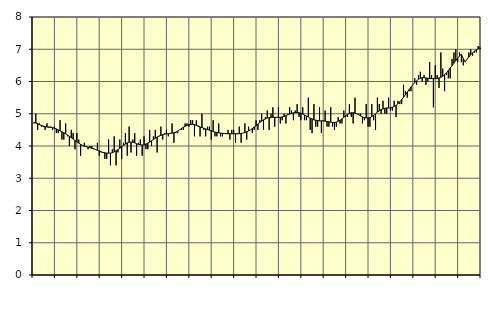
| Category | Information och kommunikation, SNI 58-63 | Series 1 |
|---|---|---|
| nan | 4.7 | 4.73 |
| 1.0 | 5 | 4.71 |
| 1.0 | 4.5 | 4.69 |
| 1.0 | 4.7 | 4.66 |
| 1.0 | 4.6 | 4.64 |
| 1.0 | 4.6 | 4.62 |
| 1.0 | 4.5 | 4.6 |
| 1.0 | 4.7 | 4.59 |
| 1.0 | 4.6 | 4.58 |
| 1.0 | 4.6 | 4.58 |
| 1.0 | 4.5 | 4.57 |
| 1.0 | 4.6 | 4.55 |
| nan | 4.4 | 4.53 |
| 2.0 | 4.4 | 4.5 |
| 2.0 | 4.8 | 4.47 |
| 2.0 | 4.2 | 4.44 |
| 2.0 | 4.2 | 4.41 |
| 2.0 | 4.7 | 4.38 |
| 2.0 | 4.3 | 4.34 |
| 2.0 | 4 | 4.3 |
| 2.0 | 4.5 | 4.26 |
| 2.0 | 4.4 | 4.22 |
| 2.0 | 3.9 | 4.17 |
| 2.0 | 4.4 | 4.13 |
| nan | 4.2 | 4.09 |
| 3.0 | 3.7 | 4.05 |
| 3.0 | 4 | 4.02 |
| 3.0 | 4.1 | 3.99 |
| 3.0 | 4 | 3.98 |
| 3.0 | 3.9 | 3.96 |
| 3.0 | 4 | 3.95 |
| 3.0 | 4 | 3.93 |
| 3.0 | 3.9 | 3.92 |
| 3.0 | 3.9 | 3.89 |
| 3.0 | 4.1 | 3.87 |
| 3.0 | 3.7 | 3.85 |
| nan | 3.8 | 3.82 |
| 4.0 | 3.8 | 3.8 |
| 4.0 | 3.6 | 3.79 |
| 4.0 | 3.6 | 3.78 |
| 4.0 | 4.2 | 3.78 |
| 4.0 | 3.4 | 3.78 |
| 4.0 | 3.9 | 3.79 |
| 4.0 | 4.3 | 3.82 |
| 4.0 | 3.4 | 3.85 |
| 4.0 | 3.8 | 3.89 |
| 4.0 | 4.2 | 3.93 |
| 4.0 | 3.6 | 3.98 |
| nan | 4.1 | 4.02 |
| 5.0 | 4.4 | 4.06 |
| 5.0 | 3.7 | 4.1 |
| 5.0 | 4.6 | 4.12 |
| 5.0 | 3.8 | 4.12 |
| 5.0 | 4.2 | 4.12 |
| 5.0 | 4.4 | 4.1 |
| 5.0 | 3.7 | 4.07 |
| 5.0 | 4.1 | 4.05 |
| 5.0 | 4.2 | 4.04 |
| 5.0 | 3.7 | 4.03 |
| 5.0 | 4.3 | 4.04 |
| nan | 3.9 | 4.06 |
| 6.0 | 3.9 | 4.09 |
| 6.0 | 4.5 | 4.12 |
| 6.0 | 4 | 4.16 |
| 6.0 | 4.3 | 4.2 |
| 6.0 | 4.5 | 4.24 |
| 6.0 | 3.8 | 4.28 |
| 6.0 | 4.3 | 4.31 |
| 6.0 | 4.6 | 4.33 |
| 6.0 | 4.2 | 4.35 |
| 6.0 | 4.4 | 4.37 |
| 6.0 | 4.5 | 4.38 |
| nan | 4.3 | 4.38 |
| 7.0 | 4.4 | 4.39 |
| 7.0 | 4.7 | 4.4 |
| 7.0 | 4.1 | 4.41 |
| 7.0 | 4.4 | 4.43 |
| 7.0 | 4.4 | 4.46 |
| 7.0 | 4.5 | 4.5 |
| 7.0 | 4.5 | 4.54 |
| 7.0 | 4.5 | 4.58 |
| 7.0 | 4.7 | 4.61 |
| 7.0 | 4.7 | 4.64 |
| 7.0 | 4.6 | 4.66 |
| nan | 4.8 | 4.67 |
| 8.0 | 4.8 | 4.67 |
| 8.0 | 4.3 | 4.66 |
| 8.0 | 4.8 | 4.64 |
| 8.0 | 4.6 | 4.62 |
| 8.0 | 4.3 | 4.59 |
| 8.0 | 5 | 4.57 |
| 8.0 | 4.5 | 4.55 |
| 8.0 | 4.3 | 4.53 |
| 8.0 | 4.6 | 4.51 |
| 8.0 | 4.6 | 4.49 |
| 8.0 | 4.2 | 4.47 |
| nan | 4.8 | 4.45 |
| 9.0 | 4.3 | 4.43 |
| 9.0 | 4.3 | 4.42 |
| 9.0 | 4.7 | 4.41 |
| 9.0 | 4.3 | 4.4 |
| 9.0 | 4.3 | 4.39 |
| 9.0 | 4.4 | 4.39 |
| 9.0 | 4.4 | 4.38 |
| 9.0 | 4.5 | 4.38 |
| 9.0 | 4.2 | 4.38 |
| 9.0 | 4.5 | 4.38 |
| 9.0 | 4.5 | 4.38 |
| nan | 4.1 | 4.38 |
| 10.0 | 4.4 | 4.38 |
| 10.0 | 4.6 | 4.38 |
| 10.0 | 4.1 | 4.39 |
| 10.0 | 4.4 | 4.4 |
| 10.0 | 4.7 | 4.42 |
| 10.0 | 4.2 | 4.44 |
| 10.0 | 4.6 | 4.47 |
| 10.0 | 4.5 | 4.5 |
| 10.0 | 4.4 | 4.54 |
| 10.0 | 4.5 | 4.59 |
| 10.0 | 4.8 | 4.63 |
| nan | 4.5 | 4.68 |
| 11.0 | 4.8 | 4.73 |
| 11.0 | 5 | 4.77 |
| 11.0 | 4.5 | 4.81 |
| 11.0 | 4.9 | 4.84 |
| 11.0 | 5.1 | 4.87 |
| 11.0 | 4.5 | 4.88 |
| 11.0 | 5 | 4.89 |
| 11.0 | 5.2 | 4.89 |
| 11.0 | 4.6 | 4.89 |
| 11.0 | 4.9 | 4.89 |
| 11.0 | 5.2 | 4.89 |
| nan | 4.7 | 4.89 |
| 12.0 | 4.8 | 4.9 |
| 12.0 | 5 | 4.92 |
| 12.0 | 4.7 | 4.94 |
| 12.0 | 5 | 4.97 |
| 12.0 | 5.2 | 4.99 |
| 12.0 | 5.1 | 5.01 |
| 12.0 | 4.8 | 5.03 |
| 12.0 | 5.1 | 5.04 |
| 12.0 | 5.3 | 5.04 |
| 12.0 | 4.9 | 5.03 |
| 12.0 | 4.8 | 5.02 |
| nan | 5.2 | 4.99 |
| 13.0 | 4.8 | 4.96 |
| 13.0 | 4.8 | 4.93 |
| 13.0 | 5.5 | 4.9 |
| 13.0 | 4.5 | 4.86 |
| 13.0 | 4.4 | 4.84 |
| 13.0 | 5.3 | 4.81 |
| 13.0 | 4.6 | 4.8 |
| 13.0 | 4.6 | 4.79 |
| 13.0 | 5.2 | 4.78 |
| 13.0 | 4.4 | 4.78 |
| 13.0 | 4.8 | 4.78 |
| nan | 5.1 | 4.77 |
| 14.0 | 4.6 | 4.76 |
| 14.0 | 4.6 | 4.75 |
| 14.0 | 5.2 | 4.74 |
| 14.0 | 4.6 | 4.73 |
| 14.0 | 4.5 | 4.73 |
| 14.0 | 4.6 | 4.74 |
| 14.0 | 4.9 | 4.77 |
| 14.0 | 4.7 | 4.8 |
| 14.0 | 4.7 | 4.84 |
| 14.0 | 5.1 | 4.89 |
| 14.0 | 4.9 | 4.94 |
| nan | 4.9 | 4.98 |
| 15.0 | 5.3 | 5.01 |
| 15.0 | 4.9 | 5.03 |
| 15.0 | 4.7 | 5.03 |
| 15.0 | 5.5 | 5.02 |
| 15.0 | 5 | 5 |
| 15.0 | 5 | 4.97 |
| 15.0 | 5 | 4.93 |
| 15.0 | 4.7 | 4.9 |
| 15.0 | 4.8 | 4.88 |
| 15.0 | 5.3 | 4.87 |
| 15.0 | 4.6 | 4.87 |
| nan | 4.6 | 4.88 |
| 16.0 | 5.3 | 4.91 |
| 16.0 | 4.8 | 4.95 |
| 16.0 | 4.5 | 5 |
| 16.0 | 5.5 | 5.05 |
| 16.0 | 5.3 | 5.09 |
| 16.0 | 5 | 5.13 |
| 16.0 | 5.4 | 5.15 |
| 16.0 | 5 | 5.17 |
| 16.0 | 5 | 5.18 |
| 16.0 | 5.5 | 5.18 |
| 16.0 | 5.1 | 5.18 |
| nan | 5.1 | 5.2 |
| 17.0 | 5.4 | 5.23 |
| 17.0 | 4.9 | 5.26 |
| 17.0 | 5.4 | 5.31 |
| 17.0 | 5.3 | 5.37 |
| 17.0 | 5.3 | 5.44 |
| 17.0 | 5.9 | 5.51 |
| 17.0 | 5.7 | 5.59 |
| 17.0 | 5.5 | 5.67 |
| 17.0 | 5.7 | 5.75 |
| 17.0 | 5.7 | 5.83 |
| 17.0 | 5.9 | 5.9 |
| nan | 6.1 | 5.97 |
| 18.0 | 5.9 | 6.02 |
| 18.0 | 6.2 | 6.07 |
| 18.0 | 6.3 | 6.1 |
| 18.0 | 6 | 6.12 |
| 18.0 | 6.2 | 6.12 |
| 18.0 | 5.9 | 6.11 |
| 18.0 | 6 | 6.1 |
| 18.0 | 6.6 | 6.09 |
| 18.0 | 6.2 | 6.09 |
| 18.0 | 5.2 | 6.09 |
| 18.0 | 6.5 | 6.09 |
| nan | 6.2 | 6.09 |
| 19.0 | 5.8 | 6.11 |
| 19.0 | 6.9 | 6.13 |
| 19.0 | 6.4 | 6.16 |
| 19.0 | 5.7 | 6.21 |
| 19.0 | 6.2 | 6.27 |
| 19.0 | 6.1 | 6.34 |
| 19.0 | 6.1 | 6.42 |
| 19.0 | 6.7 | 6.49 |
| 19.0 | 6.9 | 6.57 |
| 19.0 | 7 | 6.65 |
| 19.0 | 6.6 | 6.72 |
| nan | 6.9 | 6.79 |
| 20.0 | 6.6 | 6.85 |
| 20.0 | 6.5 | 6.71 |
| 20.0 | 6.6 | 6.61 |
| 20.0 | 6.7 | 6.69 |
| 20.0 | 6.9 | 6.76 |
| 20.0 | 7 | 6.83 |
| 20.0 | 6.8 | 6.89 |
| 20.0 | 6.9 | 6.94 |
| 20.0 | 6.9 | 6.98 |
| 20.0 | 7.1 | 7.02 |
| 20.0 | 7 | 7.05 |